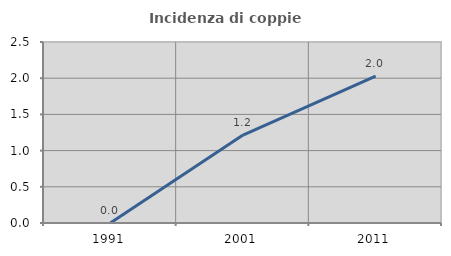
| Category | Incidenza di coppie miste |
|---|---|
| 1991.0 | 0 |
| 2001.0 | 1.215 |
| 2011.0 | 2.027 |